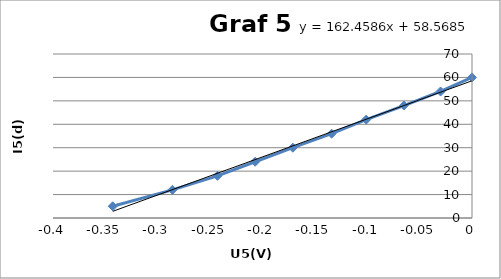
| Category | Series 0 |
|---|---|
| 0.0 | 60 |
| -0.03 | 54 |
| -0.065 | 48 |
| -0.101 | 42 |
| -0.134 | 36 |
| -0.171 | 30 |
| -0.207 | 24 |
| -0.243 | 18 |
| -0.286 | 12 |
| -0.343 | 5 |